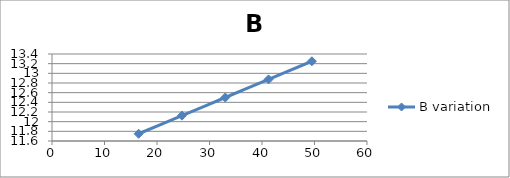
| Category | B variation |
|---|---|
| 16.5 | 11.75 |
| 24.75 | 12.125 |
| 33.0 | 12.5 |
| 41.25 | 12.875 |
| 49.5 | 13.25 |